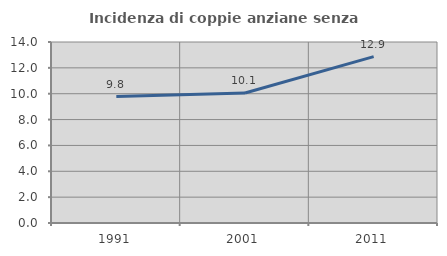
| Category | Incidenza di coppie anziane senza figli  |
|---|---|
| 1991.0 | 9.777 |
| 2001.0 | 10.056 |
| 2011.0 | 12.869 |